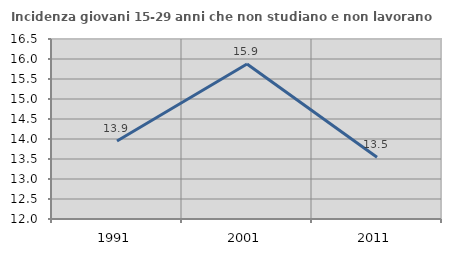
| Category | Incidenza giovani 15-29 anni che non studiano e non lavorano  |
|---|---|
| 1991.0 | 13.948 |
| 2001.0 | 15.873 |
| 2011.0 | 13.542 |